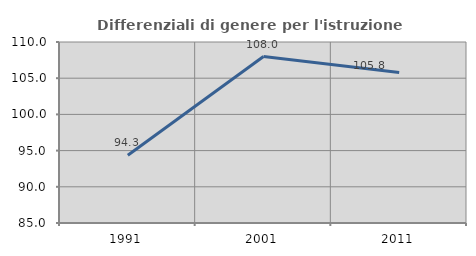
| Category | Differenziali di genere per l'istruzione superiore |
|---|---|
| 1991.0 | 94.349 |
| 2001.0 | 107.988 |
| 2011.0 | 105.791 |